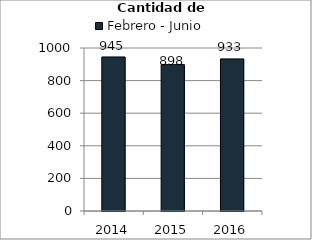
| Category | Febrero - Junio |
|---|---|
| 2014.0 | 945 |
| 2015.0 | 898 |
| 2016.0 | 933 |